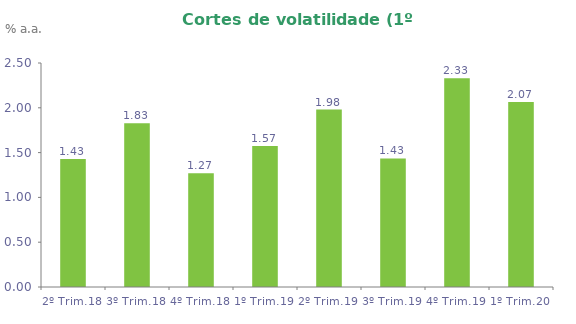
| Category | Series 0 |
|---|---|
| 2º Trim.18 | 1.429 |
| 3º Trim.18 | 1.827 |
| 4º Trim.18 | 1.268 |
| 1º Trim.19 | 1.573 |
| 2º Trim.19 | 1.98 |
| 3º Trim.19 | 1.435 |
| 4º Trim.19 | 2.329 |
| 1º Trim.20 | 2.065 |